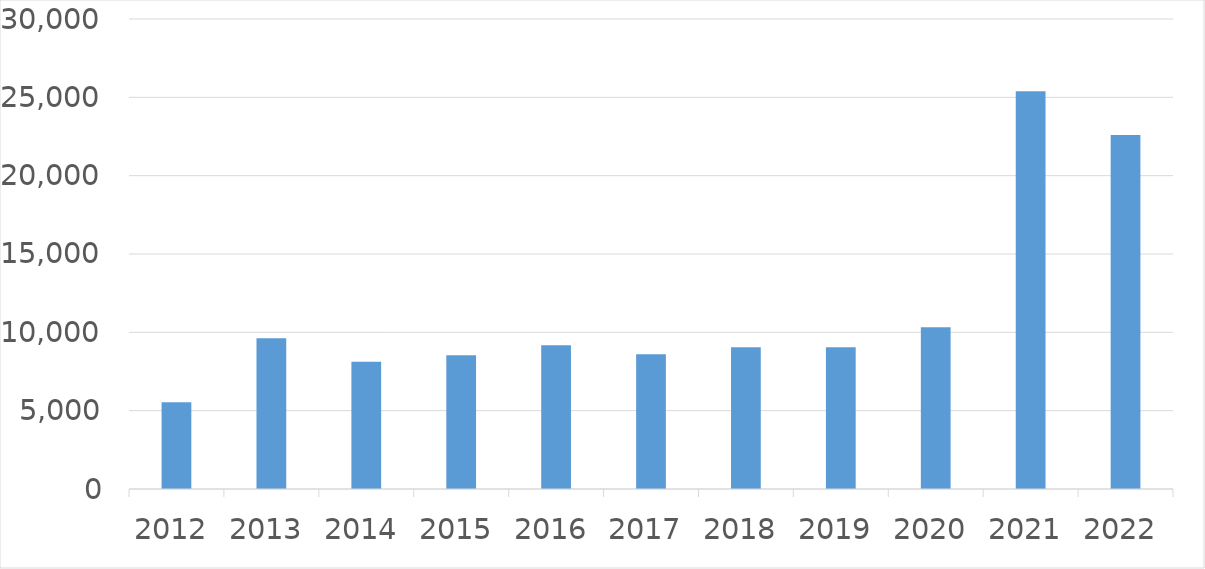
| Category | Series 0 |
|---|---|
| 2012 | 5536 |
| 2013 | 9615 |
| 2014 | 8126 |
| 2015 | 8535 |
| 2016 | 9171 |
| 2017 | 8603 |
| 2018 | 9048 |
| 2019 | 9054 |
| 2020 | 10332 |
| 2021 | 25382 |
| 2022 | 22595 |